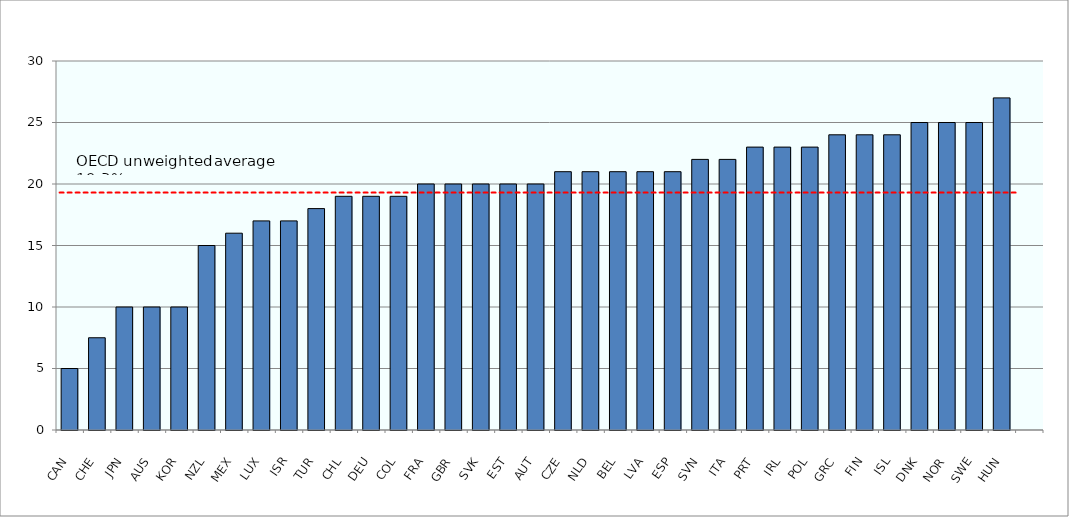
| Category | Series 0 |
|---|---|
| CAN | 5 |
| CHE | 7.5 |
| JPN | 10 |
| AUS | 10 |
| KOR | 10 |
| NZL | 15 |
| MEX | 16 |
| LUX | 17 |
| ISR | 17 |
| TUR | 18 |
| CHL | 19 |
| DEU | 19 |
| COL | 19 |
| FRA | 20 |
| GBR | 20 |
| SVK | 20 |
| EST | 20 |
| AUT | 20 |
| CZE | 21 |
| NLD | 21 |
| BEL | 21 |
| LVA | 21 |
| ESP | 21 |
| SVN | 22 |
| ITA | 22 |
| PRT | 23 |
| IRL | 23 |
| POL | 23 |
| GRC | 24 |
| FIN | 24 |
| ISL | 24 |
| DNK | 25 |
| NOR | 25 |
| SWE | 25 |
| HUN | 27 |